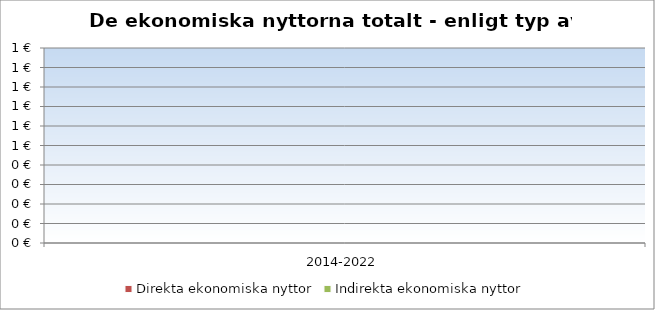
| Category | Direkta ekonomiska nyttor | Indirekta ekonomiska nyttor |
|---|---|---|
| 2014-2022 | 0 | 0 |